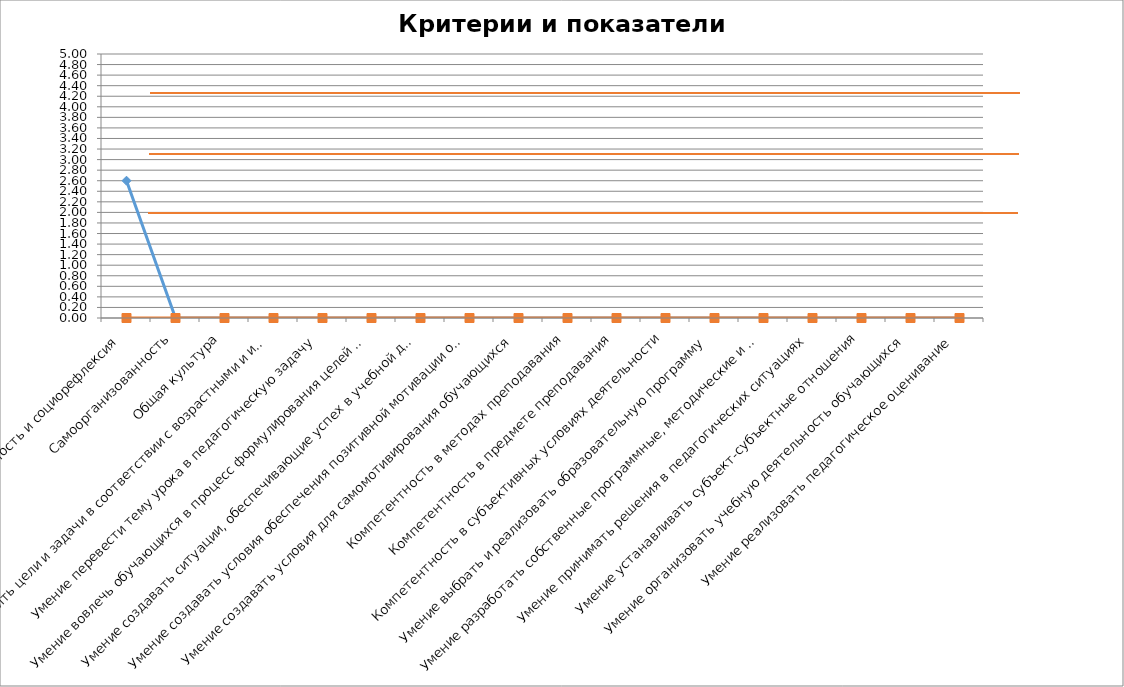
| Category | Series 0 | Самооценка |
|---|---|---|
| Эмпатийность и социорефлексия | 2.6 | 0 |
| Самоорганизованность | 0 | 0 |
| Общая культура | 0 | 0 |
| Умение ставить цели и задачи в соответствии с возрастными и индивидуальными особенностями  обучающихся | 0 | 0 |
| Умение перевести тему урока в педагогическую задачу | 0 | 0 |
| Умение вовлечь обучающихся в процесс формулирования целей и задач | 0 | 0 |
| Умение создавать ситуации, обеспечивающие успех в учебной деятельности | 0 | 0 |
| Умение создавать условия обеспечения позитивной мотивации обучающихся | 0 | 0 |
| Умение создавать условия для самомотивирования обучающихся | 0 | 0 |
| Компетентность в методах преподавания | 0 | 0 |
| Компетентность в предмете преподавания | 0 | 0 |
| Компетентность в субъективных условиях деятельности | 0 | 0 |
| Умение выбрать и реализовать образовательную программу | 0 | 0 |
| Умение разработать собственные программные, методические и дидактические | 0 | 0 |
| Умение принимать решения в педагогических ситуациях | 0 | 0 |
| Умение устанавливать субъект-субъектные отношения | 0 | 0 |
| Умение организовать учебную деятельность обучающихся | 0 | 0 |
| Умение реализовать педагогическое оценивание | 0 | 0 |